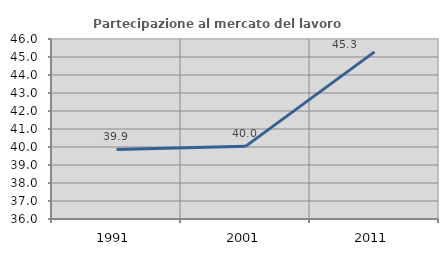
| Category | Partecipazione al mercato del lavoro  femminile |
|---|---|
| 1991.0 | 39.863 |
| 2001.0 | 40.036 |
| 2011.0 | 45.283 |